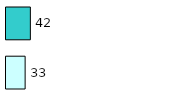
| Category | Series 0 | Series 1 |
|---|---|---|
| 0 | 33 | 42 |